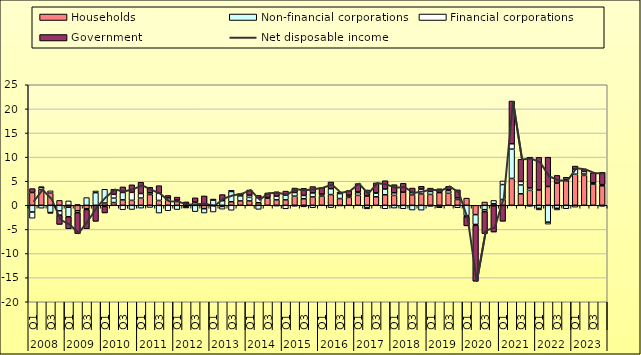
| Category | Households | Non-financial corporations | Financial corporations | Government |
|---|---|---|---|---|
| 0 | 2.66 | -1.39 | -1.29 | 0.81 |
| 1 | 3.26 | -0.6 | 0.45 | 0.14 |
| 2 | 2.53 | -1.5 | 0.47 | -0.13 |
| 3 | 1.02 | -1.13 | -0.9 | -1.93 |
| 4 | -0.39 | -1.98 | 0.91 | -2.5 |
| 5 | -1.13 | 0.16 | -0.4 | -4.34 |
| 6 | -0.74 | 1.6 | -0.13 | -3.98 |
| 7 | -0.01 | 2.62 | 0.35 | -3.31 |
| 8 | 0.48 | 2.85 | -0.24 | -1.34 |
| 9 | 0.57 | 0.91 | 0.79 | 1.06 |
| 10 | 1.13 | 1.53 | -0.91 | 1.16 |
| 11 | 1.03 | -0.87 | 1.65 | 1.57 |
| 12 | 1.5 | -0.59 | 0.94 | 2.33 |
| 13 | 2.23 | 0.35 | -0.45 | 1.17 |
| 14 | 1.01 | -1.61 | 1.48 | 1.58 |
| 15 | 1.02 | 0.52 | -1.12 | 0.5 |
| 16 | 0.91 | -0.88 | 0.17 | 0.62 |
| 17 | -0.32 | -0.24 | 0.36 | 0.35 |
| 18 | 0.03 | -1.31 | 0.61 | 0.92 |
| 19 | -0.7 | -0.9 | 0.29 | 1.66 |
| 20 | -0.04 | 1.08 | -1.35 | 0.22 |
| 21 | -0.24 | 0.96 | -0.56 | 1.27 |
| 22 | 0.74 | 2.12 | -1.03 | 0.25 |
| 23 | 0.91 | 1.08 | 0.05 | 0.39 |
| 24 | 0.91 | 0.74 | 0.46 | 1.07 |
| 25 | 0.53 | -0.84 | 1.06 | 0.46 |
| 26 | 1.49 | 0.08 | 0.05 | 0.95 |
| 27 | 1.13 | 0.78 | -0.16 | 0.9 |
| 28 | 1.13 | 0.98 | -0.73 | 0.84 |
| 29 | 1.9 | 0.76 | -0.2 | 0.92 |
| 30 | 1.36 | 0.69 | -0.32 | 1.47 |
| 31 | 1.74 | 0.83 | -0.5 | 1.32 |
| 32 | 1.9 | 0.15 | 0.27 | 1.36 |
| 33 | 2.23 | 1.22 | -0.48 | 1.38 |
| 34 | 1.4 | 1.03 | -0.13 | 0.32 |
| 35 | 1.63 | 0.11 | 0.36 | 0.97 |
| 36 | 2.06 | 0.56 | 0.16 | 1.73 |
| 37 | 1.93 | -0.48 | -0.26 | 1.25 |
| 38 | 1.77 | 0.75 | 0.06 | 2.07 |
| 39 | 2.19 | 1.19 | -0.71 | 1.72 |
| 40 | 2.06 | -0.58 | 0.53 | 1.69 |
| 41 | 2.71 | -0.72 | 0.01 | 1.85 |
| 42 | 2.14 | -0.98 | 0.47 | 0.97 |
| 43 | 2.35 | -1.01 | 1 | 0.6 |
| 44 | 2.26 | 0.62 | -0.23 | 0.68 |
| 45 | 2.63 | -0.38 | -0.02 | 0.8 |
| 46 | 2.49 | 0.56 | 0.15 | 0.74 |
| 47 | 1.2 | 0.36 | -0.5 | 1.65 |
| 48 | 1.49 | -2.13 | -0.25 | -1.88 |
| 49 | -1.93 | -2.04 | -0.17 | -11.6 |
| 50 | 0.68 | -0.91 | -0.41 | -4.55 |
| 51 | 0.32 | 0.69 | -0.09 | -5.45 |
| 52 | 1.19 | 3.11 | 0.75 | -3.31 |
| 53 | 5.57 | 6.08 | 1.11 | 8.87 |
| 54 | 2.39 | 1.83 | 0.73 | 4.6 |
| 55 | 3.1 | -0.22 | 0.5 | 6.37 |
| 56 | 3.18 | -0.64 | -0.32 | 6.76 |
| 57 | 3.9 | -3.49 | -0.42 | 6.08 |
| 58 | 4.6 | -0.62 | -0.35 | 1.61 |
| 59 | 5.3 | -0.71 | 0.39 | 0.13 |
| 60 | 6.45 | 1.02 | -0.39 | 0.67 |
| 61 | 6.2 | 0.3 | 0.51 | 0.49 |
| 62 | 4.43 | 0.02 | 0.22 | 2.07 |
| 63 | 4.04 | 0.25 | -0.22 | 2.55 |